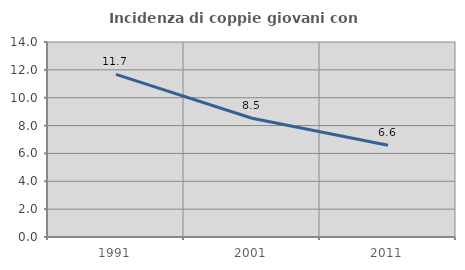
| Category | Incidenza di coppie giovani con figli |
|---|---|
| 1991.0 | 11.679 |
| 2001.0 | 8.529 |
| 2011.0 | 6.59 |